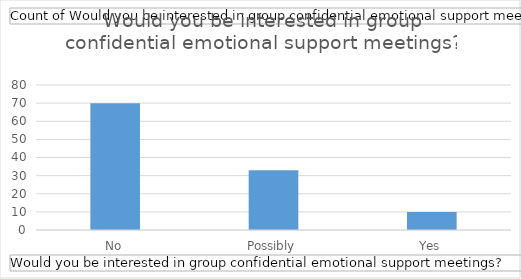
| Category | Total |
|---|---|
| No | 70 |
| Possibly | 33 |
| Yes | 10 |